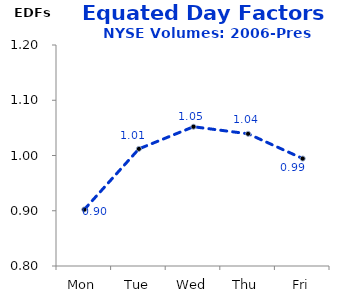
| Category | 1991-05 |
|---|---|
| Mon | 0.902 |
| Tue | 1.012 |
| Wed | 1.052 |
| Thu | 1.039 |
| Fri | 0.994 |